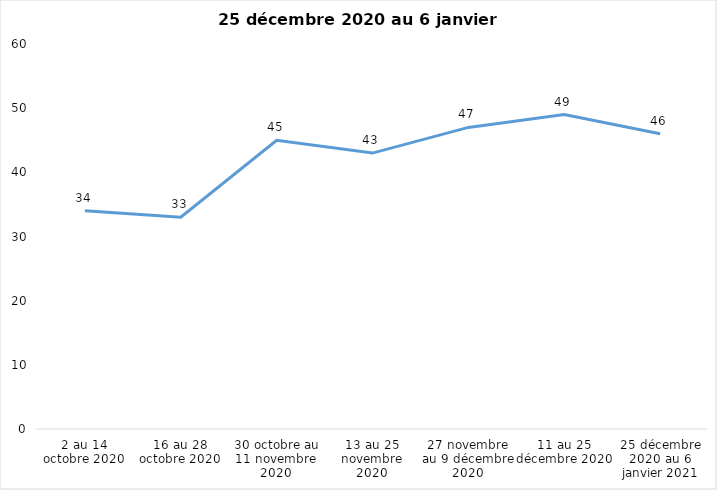
| Category | Toujours aux trois mesures |
|---|---|
| 2 au 14 octobre 2020 | 34 |
| 16 au 28 octobre 2020 | 33 |
| 30 octobre au 11 novembre 2020 | 45 |
| 13 au 25 novembre 2020 | 43 |
| 27 novembre au 9 décembre 2020 | 47 |
| 11 au 25 décembre 2020 | 49 |
| 25 décembre 2020 au 6 janvier 2021 | 46 |